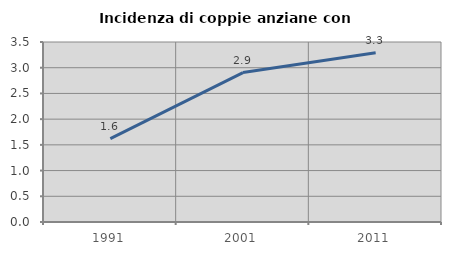
| Category | Incidenza di coppie anziane con figli |
|---|---|
| 1991.0 | 1.622 |
| 2001.0 | 2.906 |
| 2011.0 | 3.293 |